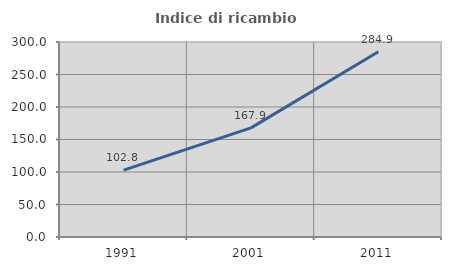
| Category | Indice di ricambio occupazionale  |
|---|---|
| 1991.0 | 102.837 |
| 2001.0 | 167.863 |
| 2011.0 | 284.938 |